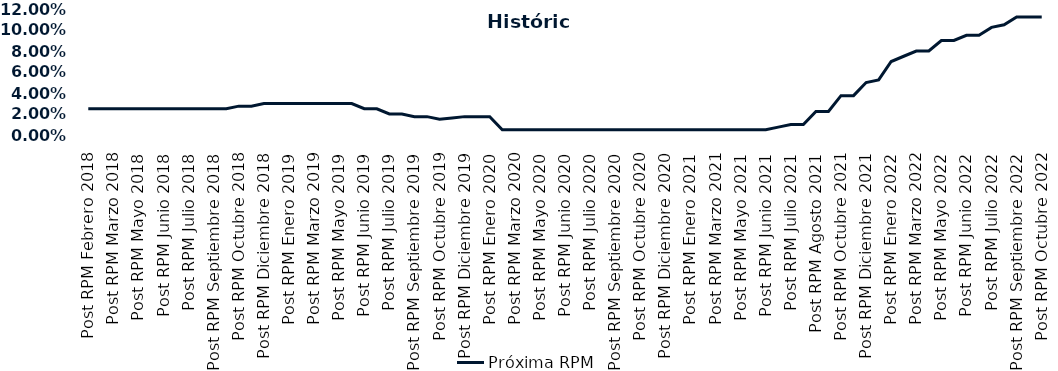
| Category | Próxima RPM |
|---|---|
| Post RPM Febrero 2018 | 0.025 |
| Pre RPM Marzo 2018 | 0.025 |
| Post RPM Marzo 2018 | 0.025 |
| Pre RPM Mayo 2018 | 0.025 |
| Post RPM Mayo 2018 | 0.025 |
| Pre RPM Junio 2018 | 0.025 |
| Post RPM Junio 2018 | 0.025 |
| Pre RPM Julio 2018 | 0.025 |
| Post RPM Julio 2018 | 0.025 |
| Pre RPM Septiembre 2018 | 0.025 |
| Post RPM Septiembre 2018 | 0.025 |
| Pre RPM Octubre 2018 | 0.025 |
| Post RPM Octubre 2018 | 0.028 |
| Pre RPM Diciembre 2018 | 0.028 |
| Post RPM Diciembre 2018 | 0.03 |
| Pre RPM Enero 2019 | 0.03 |
| Post RPM Enero 2019 | 0.03 |
| Pre RPM Marzo 2019 | 0.03 |
| Post RPM Marzo 2019 | 0.03 |
| Pre RPM Mayo 2019 | 0.03 |
| Post RPM Mayo 2019 | 0.03 |
| Pre RPM Junio 2019 | 0.03 |
| Post RPM Junio 2019 | 0.025 |
| Pre RPM Julio 2019 | 0.025 |
| Post RPM Julio 2019 | 0.02 |
| Pre RPM Septiembre 2019 | 0.02 |
| Post RPM Septiembre 2019 | 0.018 |
| Pre RPM Octubre 2019 | 0.018 |
| Post RPM Octubre 2019 | 0.015 |
| Pre RPM Diciembre 2019 | 0.016 |
| Post RPM Diciembre 2019 | 0.018 |
| Pre RPM Enero 2020 | 0.018 |
| Post RPM Enero 2020 | 0.018 |
| Pre RPM Marzo 2020 | 0.005 |
| Post RPM Marzo 2020 | 0.005 |
| Pre RPM Mayo 2020 | 0.005 |
| Post RPM Mayo 2020 | 0.005 |
| Pre RPM Junio 2020 | 0.005 |
| Post RPM Junio 2020 | 0.005 |
| Pre RPM Julio 2020 | 0.005 |
| Post RPM Julio 2020 | 0.005 |
| Pre RPM Septiembre 2020 | 0.005 |
| Post RPM Septiembre 2020 | 0.005 |
| Pre RPM Octubre 2020 | 0.005 |
| Post RPM Octubre 2020 | 0.005 |
| Pre RPM Diciembre 2020 | 0.005 |
| Post RPM Diciembre 2020 | 0.005 |
| Pre RPM Enero 2021 | 0.005 |
| Post RPM Enero 2021 | 0.005 |
| Pre RPM Marzo 2021 | 0.005 |
| Post RPM Marzo 2021 | 0.005 |
| Pre RPM Mayo 2021 | 0.005 |
| Post RPM Mayo 2021 | 0.005 |
| Pre RPM Junio 2021 | 0.005 |
| Post RPM Junio 2021 | 0.005 |
| Pre RPM Julio 2021 | 0.008 |
| Post RPM Julio 2021 | 0.01 |
| Pre RPM Agosto 2021 | 0.01 |
| Post RPM Agosto 2021 | 0.022 |
| Pre RPM Octubre 2021 | 0.022 |
| Post RPM Octubre 2021 | 0.038 |
| Pre RPM Diciembre 2021 | 0.038 |
| Post RPM Diciembre 2021 | 0.05 |
| Pre RPM Enero 2022 | 0.052 |
| Post RPM Enero 2022 | 0.07 |
| Pre RPM Marzo 2022 | 0.075 |
| Post RPM Marzo 2022 | 0.08 |
| Pre RPM Mayo 2022 | 0.08 |
| Post RPM Mayo 2022 | 0.09 |
| Pre RPM Junio 2022 | 0.09 |
| Post RPM Junio 2022 | 0.095 |
| Pre RPM Julio 2022 | 0.095 |
| Post RPM Julio 2022 | 0.102 |
| Pre RPM Septiembre 2022 | 0.105 |
| Post RPM Septiembre 2022 | 0.112 |
| Pre RPM Octubre 2022 | 0.112 |
| Post RPM Octubre 2022 | 0.112 |